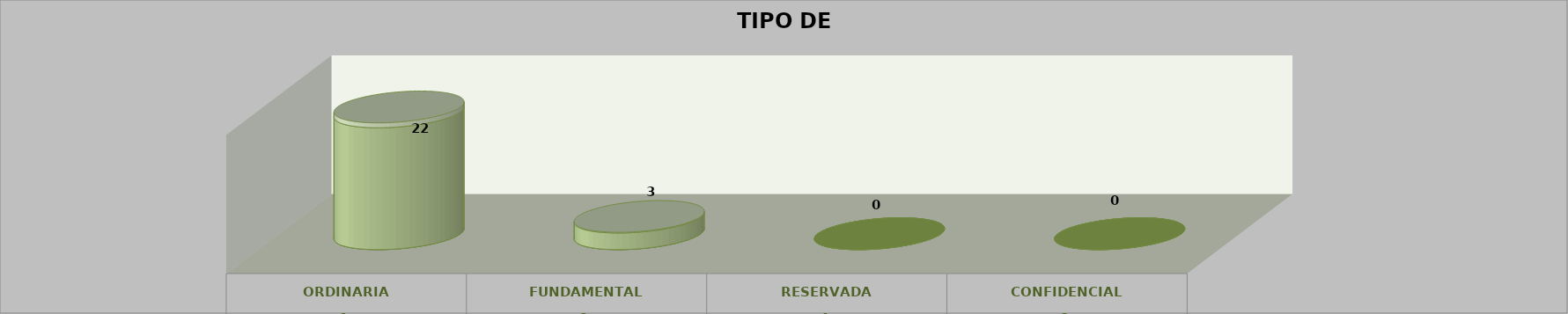
| Category | Series 0 | Series 2 | Series 1 | Series 3 | Series 4 |
|---|---|---|---|---|---|
| 0 |  |  |  | 22 | 0.88 |
| 1 |  |  |  | 3 | 0.12 |
| 2 |  |  |  | 0 | 0 |
| 3 |  |  |  | 0 | 0 |